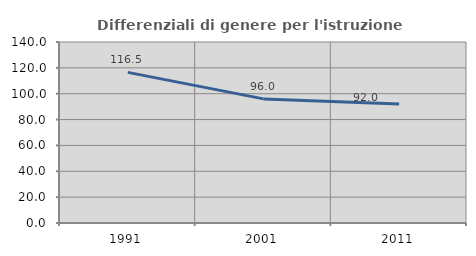
| Category | Differenziali di genere per l'istruzione superiore |
|---|---|
| 1991.0 | 116.511 |
| 2001.0 | 96 |
| 2011.0 | 91.999 |